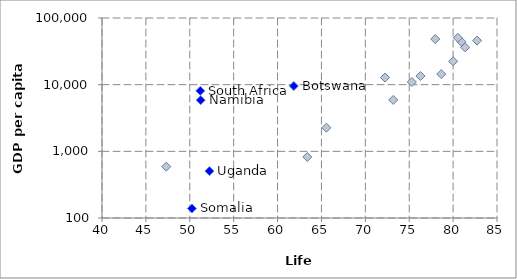
| Category | Poland France Italy Japan South Korea Burma Afghanistan Somalia South Africa Uganda Botswana Namibia Canada United states Chile Bolivia Peru Argentina Brazil |
|---|---|
| 76.28 | 13469 |
| 80.95 | 44007 |
| 81.37 | 36267 |
| 82.73 | 45870 |
| 80.0 | 22424 |
| 63.39 | 824 |
| 47.32 | 589 |
| 50.24 | 139 |
| 51.2 | 8078 |
| 52.24 | 505 |
| 61.85 | 9537 |
| 51.24 | 5862 |
| 80.54 | 50496 |
| 77.97 | 48328 |
| 78.65 | 14403 |
| 65.56 | 2264 |
| 73.18 | 5904 |
| 75.3 | 10959 |
| 72.24 | 12789 |